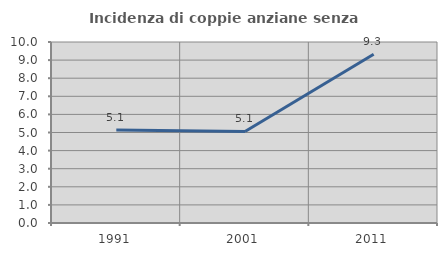
| Category | Incidenza di coppie anziane senza figli  |
|---|---|
| 1991.0 | 5.145 |
| 2001.0 | 5.059 |
| 2011.0 | 9.327 |